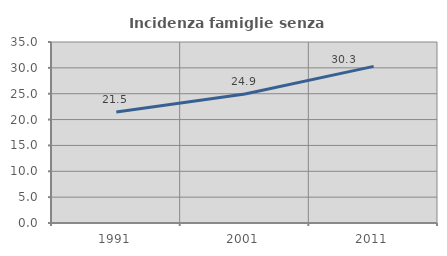
| Category | Incidenza famiglie senza nuclei |
|---|---|
| 1991.0 | 21.46 |
| 2001.0 | 24.946 |
| 2011.0 | 30.283 |